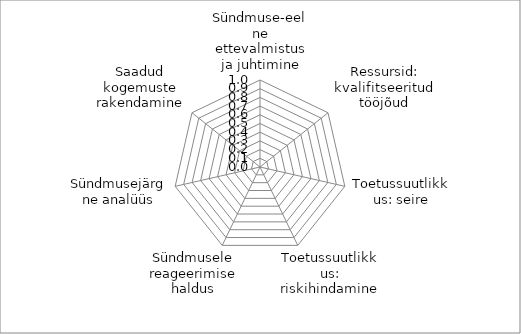
| Category | Series 0 |
|---|---|
| Sündmuse-eelne ettevalmistus ja juhtimine | 0 |
| Ressursid: kvalifitseeritud tööjõud | 0 |
| Toetussuutlikkus: seire | 0 |
| Toetussuutlikkus: riskihindamine | 0 |
| Sündmusele reageerimise haldus | 0 |
| Sündmusejärgne analüüs | 0 |
| Saadud kogemuste rakendamine | 0 |